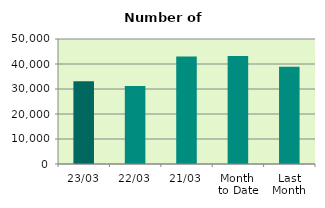
| Category | Series 0 |
|---|---|
| 23/03 | 33070 |
| 22/03 | 31168 |
| 21/03 | 43038 |
| Month 
to Date | 43216.706 |
| Last
Month | 38877.2 |